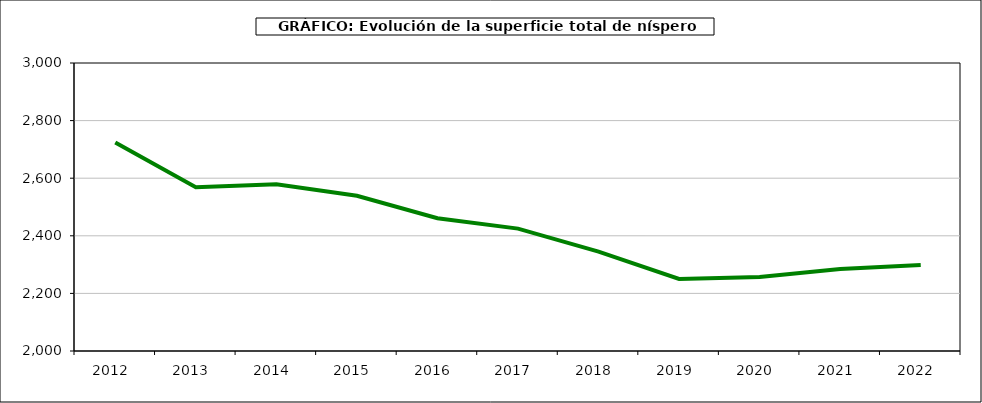
| Category | superficie níspero |
|---|---|
| 2012.0 | 2724 |
| 2013.0 | 2569 |
| 2014.0 | 2579 |
| 2015.0 | 2539 |
| 2016.0 | 2461 |
| 2017.0 | 2425 |
| 2018.0 | 2345 |
| 2019.0 | 2250 |
| 2020.0 | 2257 |
| 2021.0 | 2285 |
| 2022.0 | 2299 |